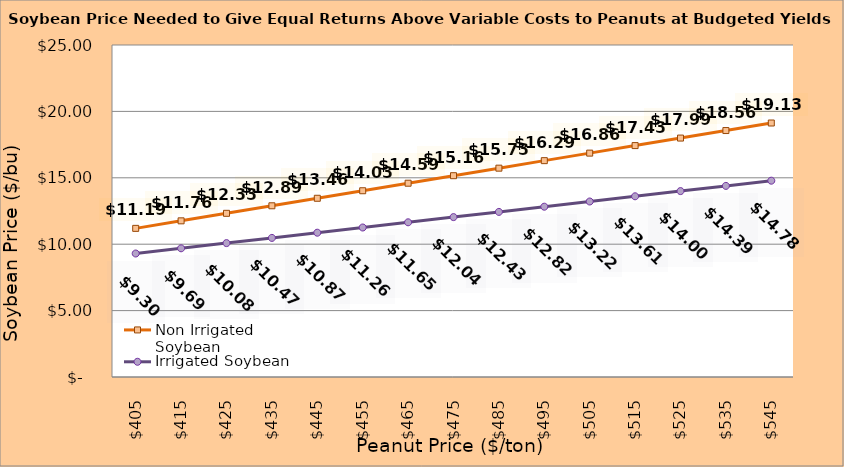
| Category | Non Irrigated Soybean | Irrigated Soybean |
|---|---|---|
| 405.0 | 11.192 | 9.299 |
| 415.0 | 11.759 | 9.691 |
| 425.0 | 12.325 | 10.082 |
| 435.0 | 12.892 | 10.474 |
| 445.0 | 13.459 | 10.866 |
| 455.0 | 14.025 | 11.257 |
| 465.0 | 14.592 | 11.649 |
| 475.0 | 15.159 | 12.041 |
| 485.0 | 15.725 | 12.432 |
| 495.0 | 16.292 | 12.824 |
| 505.0 | 16.859 | 13.216 |
| 515.0 | 17.425 | 13.607 |
| 525.0 | 17.992 | 13.999 |
| 535.0 | 18.559 | 14.391 |
| 545.0 | 19.125 | 14.782 |